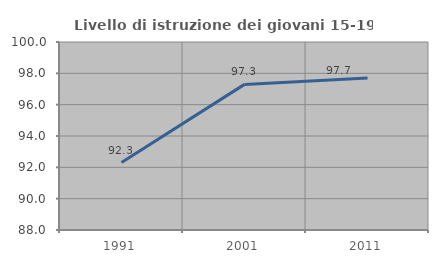
| Category | Livello di istruzione dei giovani 15-19 anni |
|---|---|
| 1991.0 | 92.308 |
| 2001.0 | 97.294 |
| 2011.0 | 97.709 |